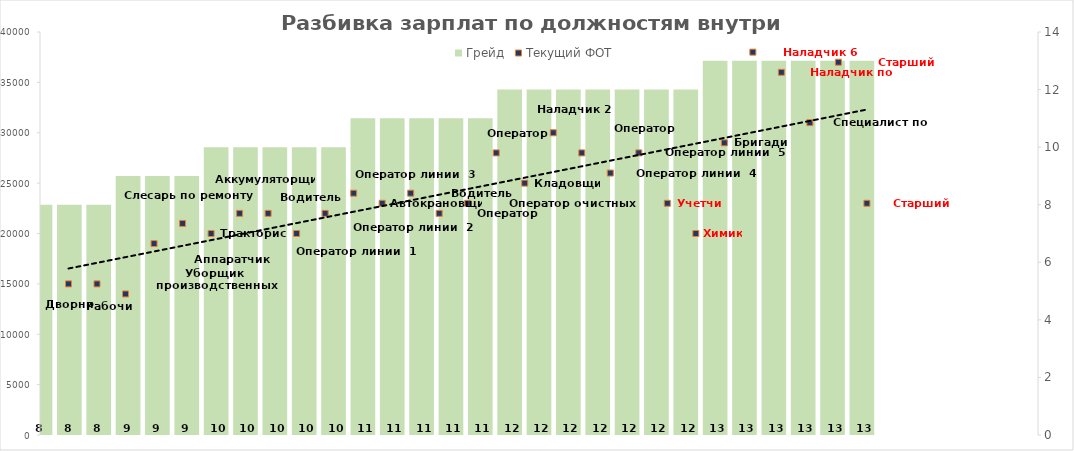
| Category | Грейд |
|---|---|
| Дворник | 8 |
| Рабочий | 8 |
| Уборщик производственных помещений | 8 |
| Аппаратчик химводоочистки | 9 |
| Слесарь по ремонту автомобилей | 9 |
| Тракторист | 9 |
| Аккумуляторщик | 10 |
| Водитель автомобиля  | 10 |
| Оператор линии  1 разряд | 10 |
| Оператор линии  2 разряд | 10 |
| Оператор линии  3 разряд | 10 |
| Автокрановщик | 11 |
| Водитель погрузчика | 11 |
| Оператор котельной | 11 |
| Оператор очистных сооружений | 11 |
| Оператор штабелера | 11 |
| Кладовщик | 12 |
| Наладчик 2 разряда | 12 |
| Оператор водоподготовки | 12 |
| Оператор линии  4 разряд | 12 |
| Оператор линии  5 разряд | 12 |
| Учетчик | 12 |
| Химик | 12 |
| Бригадир | 13 |
| Наладчик 6 разряда | 13 |
| Наладчик по сервису | 13 |
| Специалист по учету | 13 |
| Старший кладовщик | 13 |
| Старший химик | 13 |